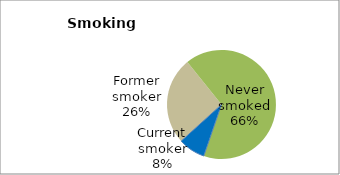
| Category | Series 0 |
|---|---|
| Current smoker | 7.997 |
| Former smoker | 25.951 |
| Never smoked | 66.052 |